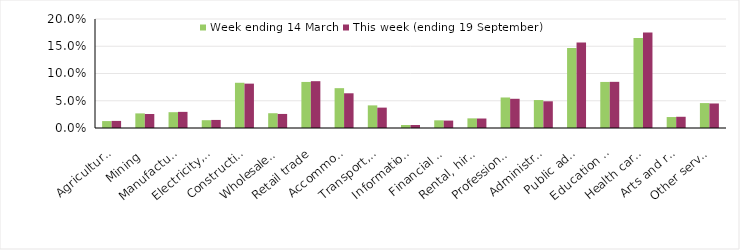
| Category | Week ending 14 March | This week (ending 19 September) |
|---|---|---|
| Agriculture, forestry and fishing | 0.013 | 0.013 |
| Mining | 0.027 | 0.026 |
| Manufacturing | 0.029 | 0.03 |
| Electricity, gas, water and waste services | 0.014 | 0.015 |
| Construction | 0.083 | 0.081 |
| Wholesale trade | 0.027 | 0.026 |
| Retail trade | 0.084 | 0.086 |
| Accommodation and food services | 0.073 | 0.064 |
| Transport, postal and warehousing | 0.042 | 0.037 |
| Information media and telecommunications | 0.006 | 0.006 |
| Financial and insurance services | 0.014 | 0.014 |
| Rental, hiring and real estate services | 0.018 | 0.017 |
| Professional, scientific and technical services | 0.056 | 0.054 |
| Administrative and support services | 0.051 | 0.049 |
| Public administration and safety | 0.147 | 0.157 |
| Education and training | 0.084 | 0.085 |
| Health care and social assistance | 0.165 | 0.175 |
| Arts and recreation services | 0.02 | 0.021 |
| Other services | 0.046 | 0.045 |